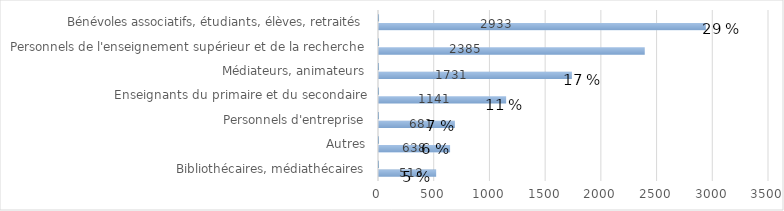
| Category | Bibliothécaires, médiathécaires |
|---|---|
| Bibliothécaires, médiathécaires | 0.05 |
| Autres | 0.06 |
| Personnels d'entreprise | 0.07 |
| Enseignants du primaire et du secondaire | 0.11 |
| Médiateurs, animateurs | 0.17 |
| Personnels de l'enseignement supérieur et de la recherche | 0.24 |
| Bénévoles associatifs, étudiants, élèves, retraités | 0.29 |